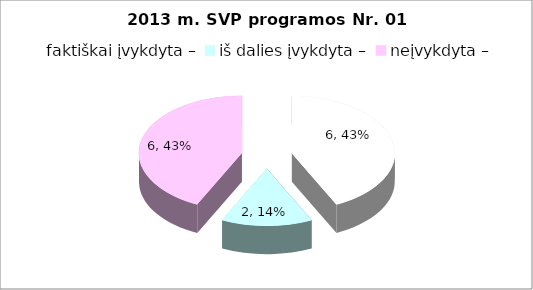
| Category | Series 0 |
|---|---|
| 0 | 6 |
| 1 | 2 |
| 2 | 6 |